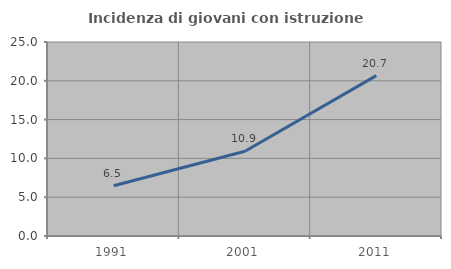
| Category | Incidenza di giovani con istruzione universitaria |
|---|---|
| 1991.0 | 6.475 |
| 2001.0 | 10.92 |
| 2011.0 | 20.667 |